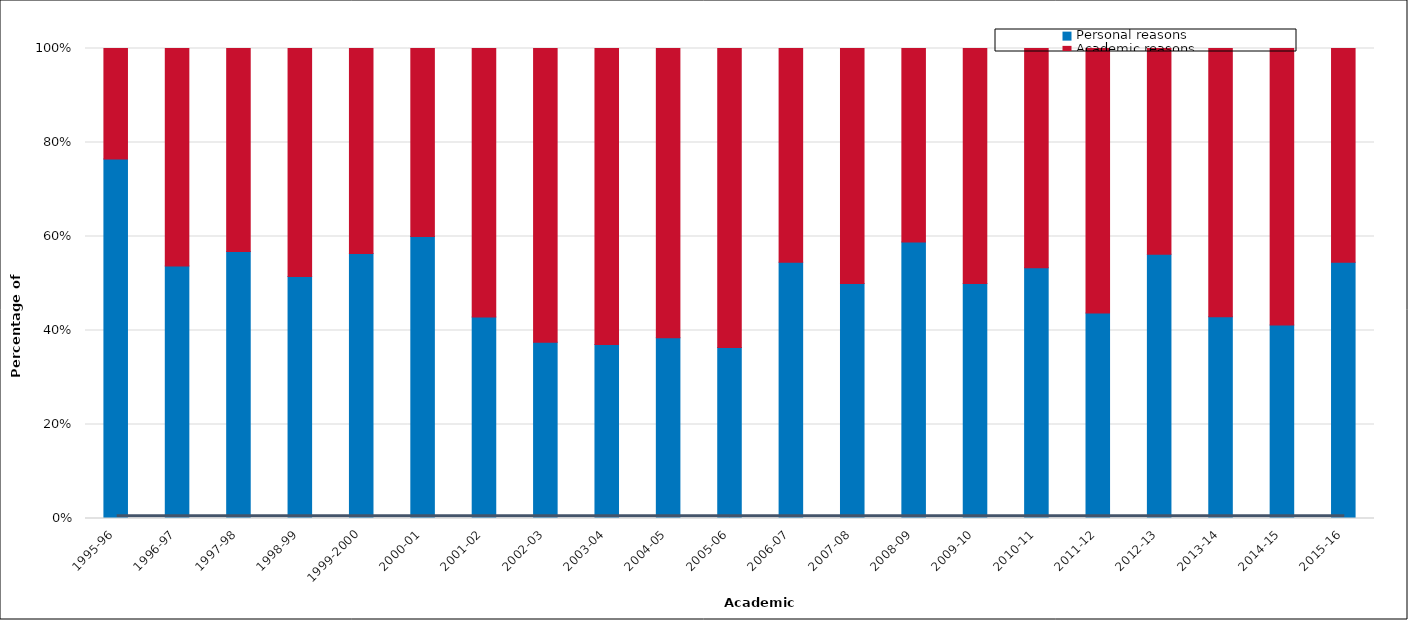
| Category | Personal reasons | Academic reasons |
|---|---|---|
| 1995-96 | 0.765 | 0.235 |
| 1996-97 | 0.537 | 0.463 |
| 1997-98 | 0.568 | 0.432 |
| 1998-99 | 0.515 | 0.485 |
| 1999-2000 | 0.564 | 0.436 |
| 2000-01 | 0.6 | 0.4 |
| 2001-02 | 0.429 | 0.571 |
| 2002-03 | 0.375 | 0.625 |
| 2003-04 | 0.37 | 0.63 |
| 2004-05 | 0.385 | 0.615 |
| 2005-06 | 0.364 | 0.636 |
| 2006-07 | 0.545 | 0.455 |
| 2007-08 | 0.5 | 0.5 |
| 2008-09 | 0.588 | 0.412 |
| 2009-10 | 0.5 | 0.5 |
| 2010-11 | 0.533 | 0.467 |
| 2011-12 | 0.437 | 0.563 |
| 2012-13 | 0.562 | 0.437 |
| 2013-14 | 0.429 | 0.571 |
| 2014-15 | 0.412 | 0.588 |
| 2015-16 | 0.545 | 0.455 |